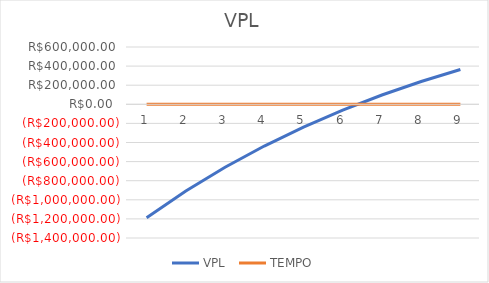
| Category | VPL  | TEMPO |
|---|---|---|
| 0 | -1187500 | 1 |
| 1 | -908482.143 | 2 |
| 2 | -659359.056 | 3 |
| 3 | -436927.729 | 4 |
| 4 | -238328.329 | 5 |
| 5 | -61007.437 | 6 |
| 6 | 97314.789 | 7 |
| 7 | 238673.918 | 8 |
| 8 | 364887.427 | 9 |